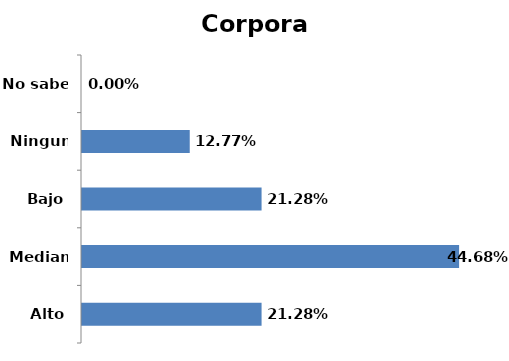
| Category | Series 0 |
|---|---|
| Alto | 0.213 |
| Mediano | 0.447 |
| Bajo | 0.213 |
| Ninguno | 0.128 |
| No sabe | 0 |